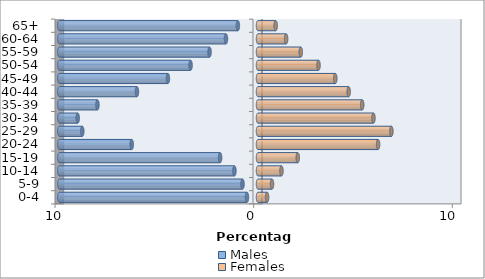
| Category | Males | Females |
|---|---|---|
| 0-4 | -0.556 | 0.458 |
| 5-9 | -0.78 | 0.705 |
| 10-14 | -1.188 | 1.18 |
| 15-19 | -1.908 | 2.001 |
| 20-24 | -6.356 | 6.045 |
| 25-29 | -8.846 | 6.715 |
| 30-34 | -9.076 | 5.811 |
| 35-39 | -8.083 | 5.246 |
| 40-44 | -6.094 | 4.564 |
| 45-49 | -4.535 | 3.89 |
| 50-54 | -3.394 | 3.046 |
| 55-59 | -2.439 | 2.153 |
| 60-64 | -1.613 | 1.415 |
| 65+ | -1.013 | 0.89 |